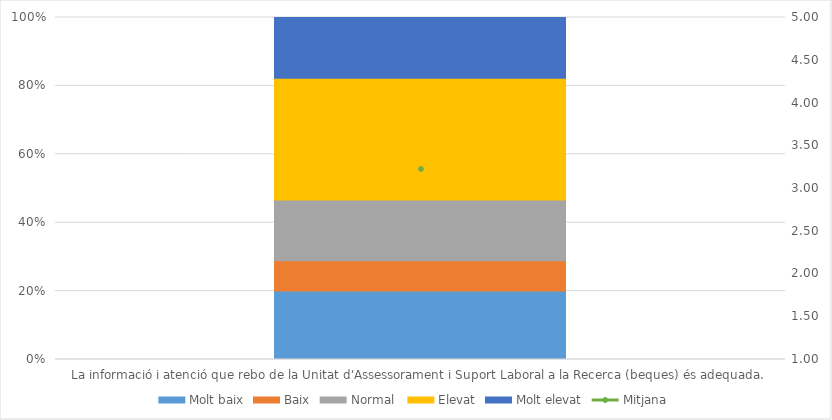
| Category | Molt baix | Baix | Normal  | Elevat | Molt elevat |
|---|---|---|---|---|---|
| La informació i atenció que rebo de la Unitat d'Assessorament i Suport Laboral a la Recerca (beques) és adequada. | 9 | 4 | 8 | 16 | 8 |